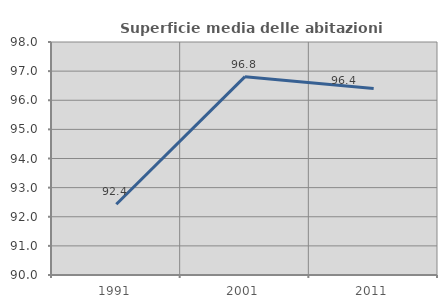
| Category | Superficie media delle abitazioni occupate |
|---|---|
| 1991.0 | 92.428 |
| 2001.0 | 96.811 |
| 2011.0 | 96.407 |